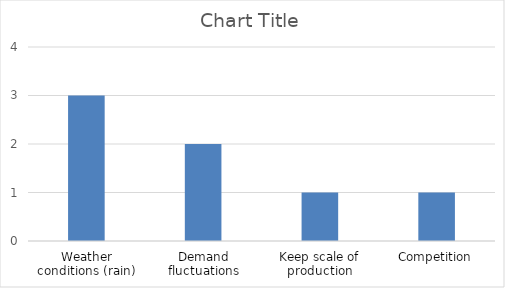
| Category | Series 0 |
|---|---|
| Weather conditions (rain) | 3 |
| Demand fluctuations | 2 |
| Keep scale of production | 1 |
| Competition | 1 |